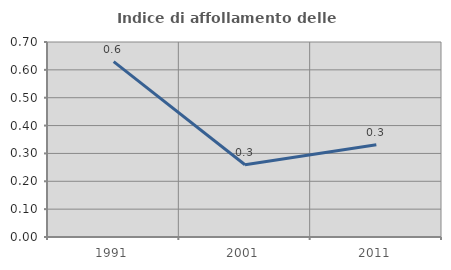
| Category | Indice di affollamento delle abitazioni  |
|---|---|
| 1991.0 | 0.63 |
| 2001.0 | 0.259 |
| 2011.0 | 0.331 |